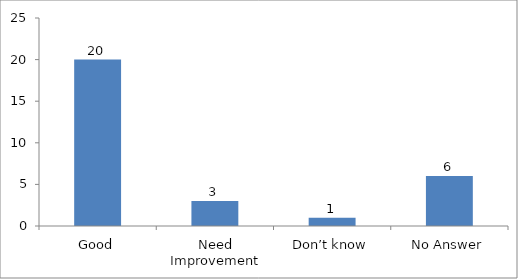
| Category | How would you rate the following aspects of the Changemaking Intelligence course?
The personal & societal outcomes of the course. |
|---|---|
| Good | 20 |
| Need Improvement | 3 |
| Don’t know | 1 |
| No Answer | 6 |